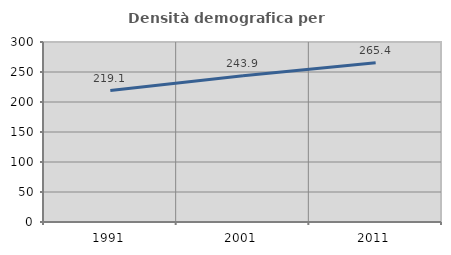
| Category | Densità demografica |
|---|---|
| 1991.0 | 219.054 |
| 2001.0 | 243.862 |
| 2011.0 | 265.359 |